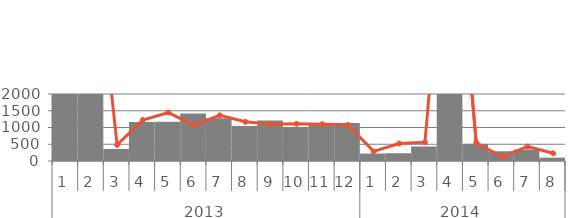
| Category | Mērķis |
|---|---|
| 0 | 8943 |
| 1 | 8300 |
| 2 | 360.4 |
| 3 | 1161.85 |
| 4 | 1170.4 |
| 5 | 1415.5 |
| 6 | 1274.9 |
| 7 | 1045 |
| 8 | 1211.155 |
| 9 | 992.75 |
| 10 | 1124 |
| 11 | 1132 |
| 12 | 223 |
| 13 | 232 |
| 14 | 432 |
| 15 | 10065 |
| 16 | 509 |
| 17 | 290 |
| 18 | 342 |
| 19 | 100 |